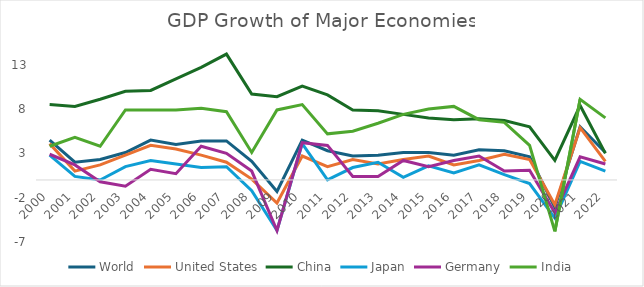
| Category | World | United States | China | Japan | Germany | India |
|---|---|---|---|---|---|---|
| 2000.0 | 4.5 | 4.1 | 8.5 | 2.8 | 2.9 | 3.8 |
| 2001.0 | 2 | 1 | 8.3 | 0.4 | 1.7 | 4.8 |
| 2002.0 | 2.3 | 1.7 | 9.1 | 0 | -0.2 | 3.8 |
| 2003.0 | 3.1 | 2.8 | 10 | 1.5 | -0.7 | 7.9 |
| 2004.0 | 4.5 | 3.9 | 10.1 | 2.2 | 1.2 | 7.9 |
| 2005.0 | 4 | 3.5 | 11.4 | 1.8 | 0.7 | 7.9 |
| 2006.0 | 4.4 | 2.8 | 12.7 | 1.4 | 3.8 | 8.1 |
| 2007.0 | 4.4 | 2 | 14.2 | 1.5 | 3 | 7.7 |
| 2008.0 | 2.1 | 0.1 | 9.7 | -1.2 | 1 | 3.1 |
| 2009.0 | -1.3 | -2.6 | 9.4 | -5.7 | -5.7 | 7.9 |
| 2010.0 | 4.5 | 2.7 | 10.6 | 4.1 | 4.2 | 8.5 |
| 2011.0 | 3.3 | 1.5 | 9.6 | 0 | 3.9 | 5.2 |
| 2012.0 | 2.7 | 2.3 | 7.9 | 1.4 | 0.4 | 5.5 |
| 2013.0 | 2.8 | 1.8 | 7.8 | 2 | 0.4 | 6.4 |
| 2014.0 | 3.1 | 2.3 | 7.4 | 0.3 | 2.2 | 7.4 |
| 2015.0 | 3.1 | 2.7 | 7 | 1.6 | 1.5 | 8 |
| 2016.0 | 2.8 | 1.7 | 6.8 | 0.8 | 2.2 | 8.3 |
| 2017.0 | 3.4 | 2.2 | 6.9 | 1.7 | 2.7 | 6.8 |
| 2018.0 | 3.3 | 2.9 | 6.7 | 0.6 | 1 | 6.5 |
| 2019.0 | 2.6 | 2.3 | 6 | -0.4 | 1.1 | 3.9 |
| 2020.0 | -3.1 | -2.8 | 2.2 | -4.3 | -3.7 | -5.8 |
| 2021.0 | 6 | 5.9 | 8.4 | 2.1 | 2.6 | 9.1 |
| 2022.0 | 3.1 | 2.1 | 3 | 1 | 1.8 | 7 |